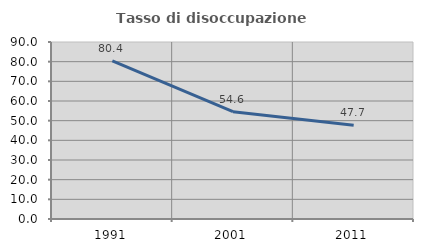
| Category | Tasso di disoccupazione giovanile  |
|---|---|
| 1991.0 | 80.372 |
| 2001.0 | 54.58 |
| 2011.0 | 47.703 |